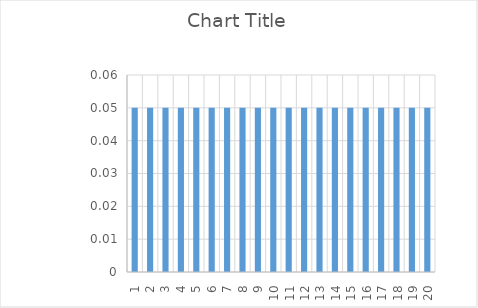
| Category | Series 0 |
|---|---|
| 1.0 | 0.05 |
| 2.0 | 0.05 |
| 3.0 | 0.05 |
| 4.0 | 0.05 |
| 5.0 | 0.05 |
| 6.0 | 0.05 |
| 7.0 | 0.05 |
| 8.0 | 0.05 |
| 9.0 | 0.05 |
| 10.0 | 0.05 |
| 11.0 | 0.05 |
| 12.0 | 0.05 |
| 13.0 | 0.05 |
| 14.0 | 0.05 |
| 15.0 | 0.05 |
| 16.0 | 0.05 |
| 17.0 | 0.05 |
| 18.0 | 0.05 |
| 19.0 | 0.05 |
| 20.0 | 0.05 |